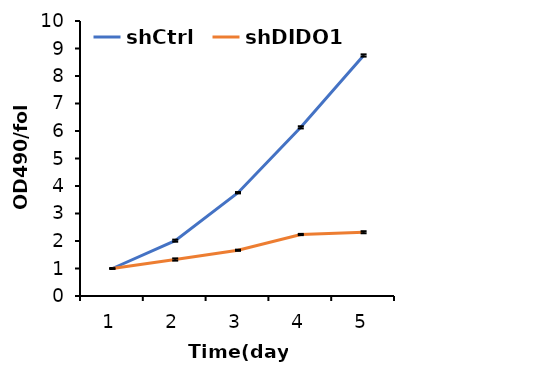
| Category | shCtrl | shDIDO1 |
|---|---|---|
| 1.0 | 1 | 1 |
| 2.0 | 2.012 | 1.327 |
| 3.0 | 3.756 | 1.664 |
| 4.0 | 6.133 | 2.236 |
| 5.0 | 8.746 | 2.319 |